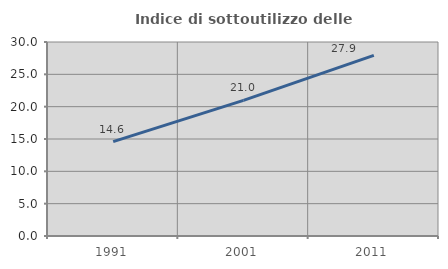
| Category | Indice di sottoutilizzo delle abitazioni  |
|---|---|
| 1991.0 | 14.583 |
| 2001.0 | 20.97 |
| 2011.0 | 27.94 |